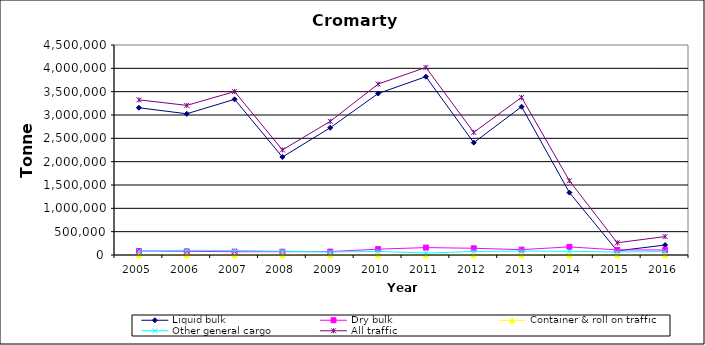
| Category | Liquid bulk | Dry bulk | Container & roll on traffic | Other general cargo | All traffic |
|---|---|---|---|---|---|
| 2005.0 | 3156000 | 86000 | 0 | 84000 | 3325000 |
| 2006.0 | 3026000 | 79000 | 0 | 101000 | 3206000 |
| 2007.0 | 3336000 | 70000 | 0 | 97000 | 3502000 |
| 2008.0 | 2100000 | 70000 | 0 | 81000 | 2252000 |
| 2009.0 | 2726958 | 73490 | 0 | 63591 | 2864039 |
| 2010.0 | 3460000 | 125000 | 0 | 78000 | 3663000 |
| 2011.0 | 3821000 | 159000 | 0 | 41000 | 4020000 |
| 2012.0 | 2408000 | 144000 | 0 | 76000 | 2628000 |
| 2013.0 | 3178000 | 115000 | 0 | 85000 | 3378000 |
| 2014.0 | 1337000 | 174000 | 0 | 80000 | 1591000 |
| 2015.0 | 89000 | 109000 | 0 | 64000 | 262000 |
| 2016.0 | 213000 | 108000 | 0 | 74000 | 395000 |